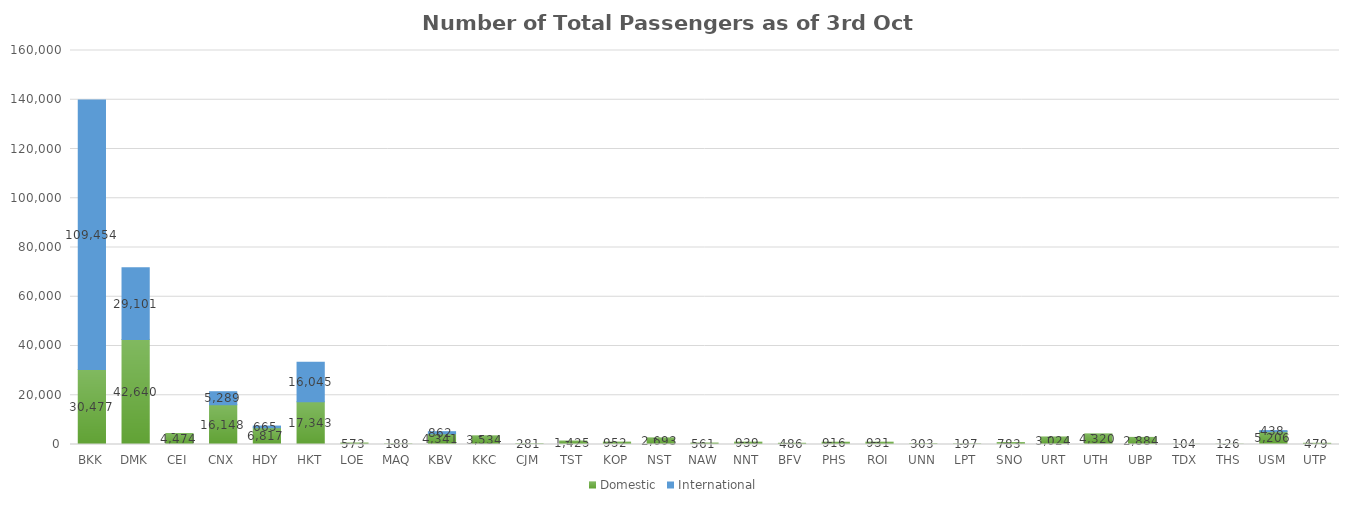
| Category | Domestic | International |
|---|---|---|
| BKK | 30477 | 109454 |
| DMK | 42640 | 29101 |
| CEI | 4474 | 0 |
| CNX | 16148 | 5289 |
| HDY | 6817 | 665 |
| HKT | 17343 | 16045 |
| LOE | 573 | 0 |
| MAQ | 188 | 0 |
| KBV | 4341 | 862 |
| KKC | 3534 | 0 |
| CJM | 281 | 0 |
| TST | 1425 | 0 |
| KOP | 952 | 0 |
| NST | 2693 | 0 |
| NAW | 561 | 0 |
| NNT | 939 | 0 |
| BFV | 486 | 0 |
| PHS | 916 | 0 |
| ROI | 931 | 0 |
| UNN | 303 | 0 |
| LPT | 197 | 0 |
| SNO | 783 | 0 |
| URT | 3024 | 0 |
| UTH | 4320 | 0 |
| UBP | 2884 | 0 |
| TDX | 104 | 0 |
| THS | 126 | 0 |
| USM | 5206 | 438 |
| UTP | 479 | 0 |